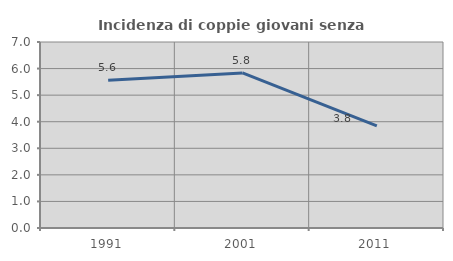
| Category | Incidenza di coppie giovani senza figli |
|---|---|
| 1991.0 | 5.563 |
| 2001.0 | 5.834 |
| 2011.0 | 3.842 |